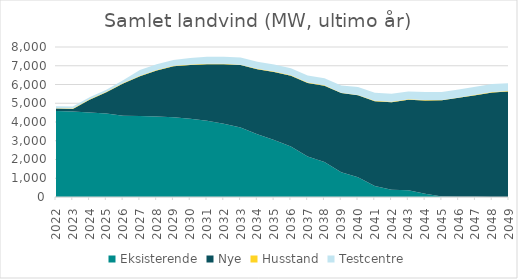
| Category | Eksisterende | Nye | Husstand | Testcentre |
|---|---|---|---|---|
| 2022.0 | 4582.886 | 131.2 | 22.2 | 110 |
| 2023.0 | 4561.106 | 131.2 | 22.3 | 110 |
| 2024.0 | 4505.977 | 679.9 | 22.4 | 110 |
| 2025.0 | 4457.842 | 1128.9 | 22.5 | 110 |
| 2026.0 | 4339.992 | 1712.6 | 22.6 | 150 |
| 2027.0 | 4318.717 | 2122.6 | 22.7 | 310 |
| 2028.0 | 4289.062 | 2462.6 | 22.8 | 310 |
| 2029.0 | 4250.112 | 2722.6 | 22.9 | 310 |
| 2030.0 | 4169.262 | 2872.6 | 23 | 350 |
| 2031.0 | 4060.187 | 3022.6 | 23.1 | 380 |
| 2032.0 | 3910.419 | 3172.6 | 23.2 | 380 |
| 2033.0 | 3711.639 | 3322.6 | 23.3 | 380 |
| 2034.0 | 3340.955 | 3472.6 | 23.4 | 380 |
| 2035.0 | 3040.77 | 3622.6 | 23.5 | 380 |
| 2036.0 | 2690.94 | 3772.6 | 23.6 | 380 |
| 2037.0 | 2159.025 | 3922.6 | 23.7 | 380 |
| 2038.0 | 1862.82 | 4072.6 | 23.8 | 380 |
| 2039.0 | 1319.935 | 4222.6 | 23.9 | 380 |
| 2040.0 | 1048.83 | 4372.6 | 24 | 420 |
| 2041.0 | 586.965 | 4522.6 | 24.1 | 420 |
| 2042.0 | 383.81 | 4672.6 | 24.2 | 420 |
| 2043.0 | 360.735 | 4822.6 | 24.3 | 420 |
| 2044.0 | 176.58 | 4972.6 | 24.4 | 420 |
| 2045.0 | 30.78 | 5122.6 | 24.5 | 420 |
| 2046.0 | 14.13 | 5272.6 | 24.6 | 420 |
| 2047.0 | 7.68 | 5422.6 | 24.7 | 420 |
| 2048.0 | 5.13 | 5572.6 | 24.8 | 420 |
| 2049.0 | 5.055 | 5621.4 | 24.9 | 420 |